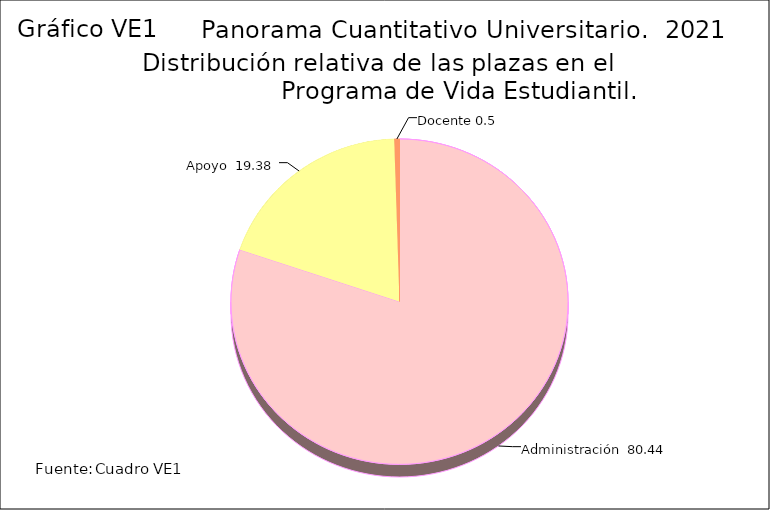
| Category | Series 3 |
|---|---|
| Administración  | 80.44 |
| Apoyo  | 19.38 |
| Docente | 0.5 |